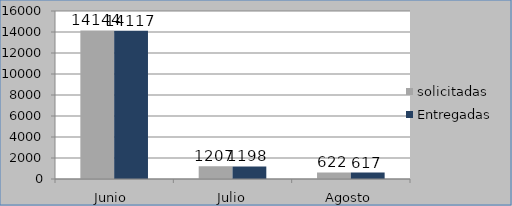
| Category | solicitadas | Entregadas |
|---|---|---|
| Junio  | 14144 | 14117 |
| Julio | 1207 | 1198 |
| Agosto | 622 | 617 |